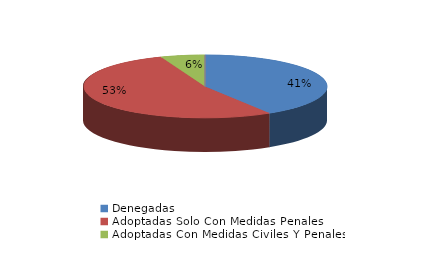
| Category | Series 0 |
|---|---|
| Denegadas | 7 |
| Adoptadas Solo Con Medidas Penales | 9 |
| Adoptadas Con Medidas Civiles Y Penales | 1 |
| Adoptadas Con Medidas Solo Civiles | 0 |